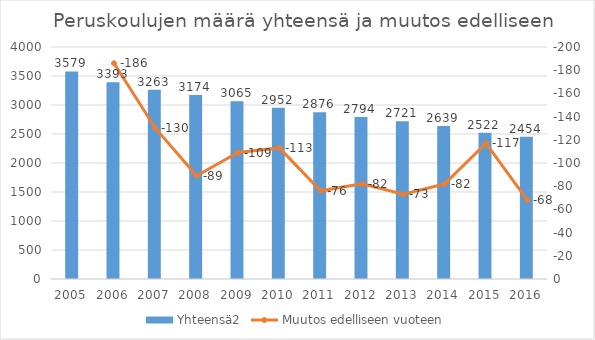
| Category | Yhteensä2 |
|---|---|
| 2005 | 3579 |
| 2006 | 3393 |
| 2007 | 3263 |
| 2008 | 3174 |
| 2009 | 3065 |
| 2010 | 2952 |
| 2011 | 2876 |
| 2012 | 2794 |
| 2013 | 2721 |
| 2014 | 2639 |
| 2015 | 2522 |
| 2016 | 2454 |